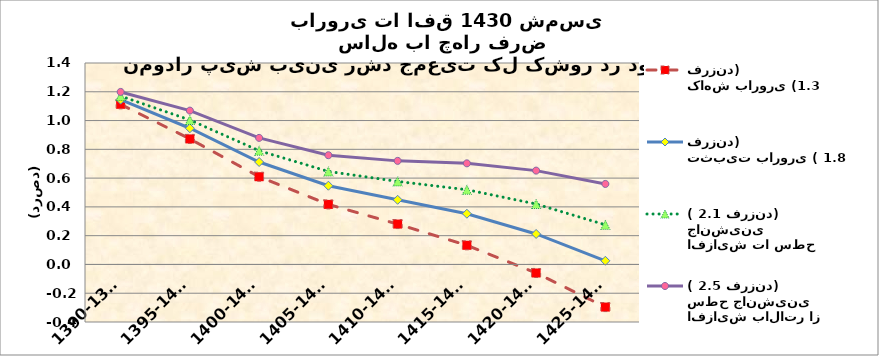
| Category | کاهش باروری (1.3 فرزند) | تثبیت باروری ( 1.8 فرزند) | افزایش تا سطح جانشینی
( 2.1 فرزند) | افزایش بالاتر از سطح جانشینی
( 2.5 فرزند) |
|---|---|---|---|---|
| 1390-1395 | 1.113 | 1.145 | 1.17 | 1.199 |
| 1395-1400 | 0.872 | 0.947 | 1.004 | 1.069 |
| 1400-1405 | 0.61 | 0.712 | 0.791 | 0.88 |
| 1405-1410 | 0.417 | 0.547 | 0.646 | 0.759 |
| 1410-1415 | 0.281 | 0.449 | 0.577 | 0.72 |
| 1415-1420 | 0.133 | 0.352 | 0.519 | 0.703 |
| 1420-1425 | -0.059 | 0.212 | 0.42 | 0.652 |
| 1425-1430 | -0.296 | 0.025 | 0.275 | 0.559 |